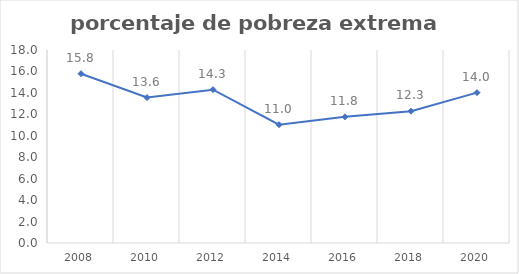
| Category | Series 0 |
|---|---|
| 2008.0 | 15.789 |
| 2010.0 | 13.565 |
| 2012.0 | 14.301 |
| 2014.0 | 11.029 |
| 2016.0 | 11.769 |
| 2018.0 | 12.292 |
| 2020.0 | 14.024 |